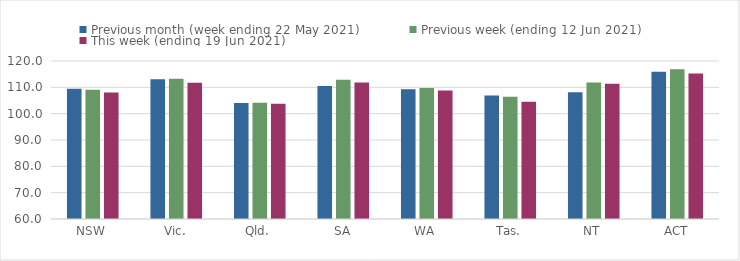
| Category | Previous month (week ending 22 May 2021) | Previous week (ending 12 Jun 2021) | This week (ending 19 Jun 2021) |
|---|---|---|---|
| NSW | 109.5 | 109.1 | 108.05 |
| Vic. | 113.1 | 113.22 | 111.72 |
| Qld. | 104.03 | 104.14 | 103.8 |
| SA | 110.51 | 112.88 | 111.84 |
| WA | 109.23 | 109.73 | 108.77 |
| Tas. | 106.87 | 106.47 | 104.52 |
| NT | 108.11 | 111.82 | 111.38 |
| ACT | 115.91 | 116.86 | 115.24 |